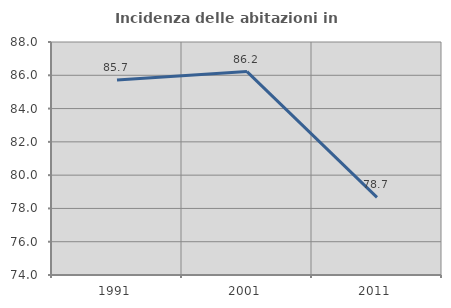
| Category | Incidenza delle abitazioni in proprietà  |
|---|---|
| 1991.0 | 85.714 |
| 2001.0 | 86.222 |
| 2011.0 | 78.665 |